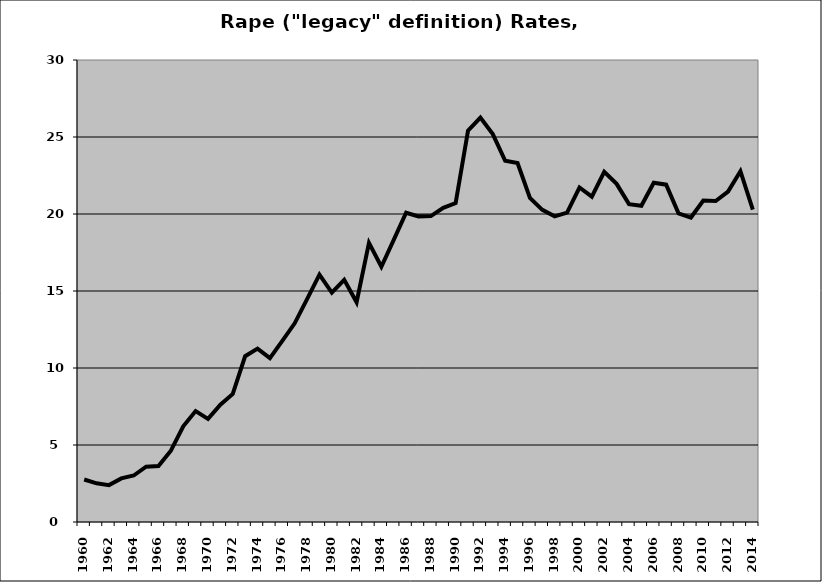
| Category | Rape |
|---|---|
| 1960.0 | 2.758 |
| 1961.0 | 2.511 |
| 1962.0 | 2.395 |
| 1963.0 | 2.832 |
| 1964.0 | 3.019 |
| 1965.0 | 3.596 |
| 1966.0 | 3.629 |
| 1967.0 | 4.631 |
| 1968.0 | 6.219 |
| 1969.0 | 7.205 |
| 1970.0 | 6.7 |
| 1971.0 | 7.618 |
| 1972.0 | 8.319 |
| 1973.0 | 10.768 |
| 1974.0 | 11.257 |
| 1975.0 | 10.636 |
| 1976.0 | 11.76 |
| 1977.0 | 12.9 |
| 1978.0 | 14.469 |
| 1979.0 | 16.059 |
| 1980.0 | 14.89 |
| 1981.0 | 15.721 |
| 1982.0 | 14.271 |
| 1983.0 | 18.123 |
| 1984.0 | 16.576 |
| 1985.0 | 18.325 |
| 1986.0 | 20.084 |
| 1987.0 | 19.846 |
| 1988.0 | 19.864 |
| 1989.0 | 20.403 |
| 1990.0 | 20.708 |
| 1991.0 | 25.409 |
| 1992.0 | 26.263 |
| 1993.0 | 25.189 |
| 1994.0 | 23.455 |
| 1995.0 | 23.307 |
| 1996.0 | 21.047 |
| 1997.0 | 20.271 |
| 1998.0 | 19.851 |
| 1999.0 | 20.094 |
| 2000.0 | 21.72 |
| 2001.0 | 21.125 |
| 2002.0 | 22.74 |
| 2003.0 | 21.957 |
| 2004.0 | 20.641 |
| 2005.0 | 20.533 |
| 2006.0 | 22.028 |
| 2007.0 | 21.904 |
| 2008.0 | 20.044 |
| 2009.0 | 19.771 |
| 2010.0 | 20.872 |
| 2011.0 | 20.841 |
| 2012.0 | 21.451 |
| 2013.0 | 22.776 |
| 2014.0 | 20.286 |